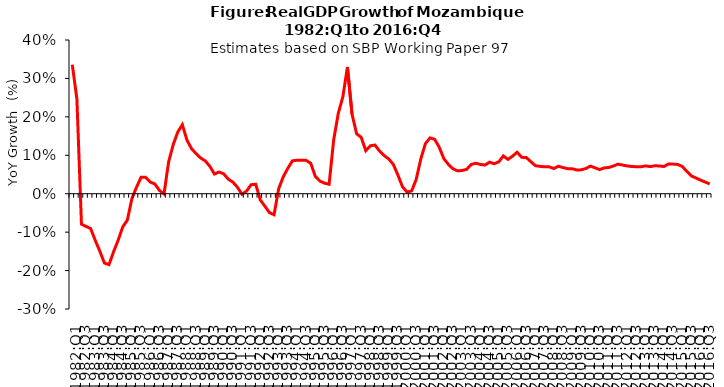
| Category | Series 0 |
|---|---|
| 1982:Q1 | 0.336 |
| 1982:Q2 | 0.247 |
| 1982:Q3 | -0.079 |
| 1982:Q4 | -0.085 |
| 1983:Q1 | -0.091 |
| 1983:Q2 | -0.121 |
| 1983:Q3 | -0.15 |
| 1983:Q4 | -0.18 |
| 1984:Q1 | -0.185 |
| 1984:Q2 | -0.151 |
| 1984:Q3 | -0.121 |
| 1984:Q4 | -0.086 |
| 1985:Q1 | -0.069 |
| 1985:Q2 | -0.013 |
| 1985:Q3 | 0.017 |
| 1985:Q4 | 0.043 |
| 1986:Q1 | 0.043 |
| 1986:Q2 | 0.03 |
| 1986:Q3 | 0.025 |
| 1986:Q4 | 0.009 |
| 1987:Q1 | 0 |
| 1987:Q2 | 0.082 |
| 1987:Q3 | 0.128 |
| 1987:Q4 | 0.161 |
| 1988:Q1 | 0.18 |
| 1988:Q2 | 0.14 |
| 1988:Q3 | 0.117 |
| 1988:Q4 | 0.104 |
| 1989:Q1 | 0.093 |
| 1989:Q2 | 0.085 |
| 1989:Q3 | 0.071 |
| 1989:Q4 | 0.051 |
| 1990:Q1 | 0.056 |
| 1990:Q2 | 0.052 |
| 1990:Q3 | 0.038 |
| 1990:Q4 | 0.03 |
| 1991:Q1 | 0.017 |
| 1991:Q2 | -0.001 |
| 1991:Q3 | 0.007 |
| 1991:Q4 | 0.023 |
| 1992:Q1 | 0.025 |
| 1992:Q2 | -0.016 |
| 1992:Q3 | -0.032 |
| 1992:Q4 | -0.049 |
| 1993:Q1 | -0.055 |
| 1993:Q2 | 0.013 |
| 1993:Q3 | 0.044 |
| 1993:Q4 | 0.066 |
| 1994:Q1 | 0.086 |
| 1994:Q2 | 0.087 |
| 1994:Q3 | 0.087 |
| 1994:Q4 | 0.087 |
| 1995:Q1 | 0.079 |
| 1995:Q2 | 0.045 |
| 1995:Q3 | 0.033 |
| 1995:Q4 | 0.027 |
| 1996:Q1 | 0.025 |
| 1996:Q2 | 0.14 |
| 1996:Q3 | 0.209 |
| 1996:Q4 | 0.252 |
| 1997:Q1 | 0.33 |
| 1997:Q2 | 0.207 |
| 1997:Q3 | 0.156 |
| 1997:Q4 | 0.147 |
| 1998:Q1 | 0.112 |
| 1998:Q2 | 0.125 |
| 1998:Q3 | 0.127 |
| 1998:Q4 | 0.111 |
| 1999:Q1 | 0.099 |
| 1999:Q2 | 0.09 |
| 1999:Q3 | 0.076 |
| 1999:Q4 | 0.049 |
| 2000:Q1 | 0.018 |
| 2000:Q2 | 0.004 |
| 2000:Q3 | 0.007 |
| 2000:Q4 | 0.037 |
| 2001:Q1 | 0.09 |
| 2001:Q2 | 0.13 |
| 2001:Q3 | 0.145 |
| 2001:Q4 | 0.142 |
| 2002:Q1 | 0.121 |
| 2002:Q2 | 0.092 |
| 2002:Q3 | 0.077 |
| 2002:Q4 | 0.065 |
| 2003:Q1 | 0.06 |
| 2003:Q2 | 0.06 |
| 2003:Q3 | 0.063 |
| 2003:Q4 | 0.076 |
| 2004:Q1 | 0.079 |
| 2004:Q2 | 0.076 |
| 2004:Q3 | 0.075 |
| 2004:Q4 | 0.082 |
| 2005:Q1 | 0.078 |
| 2005:Q2 | 0.083 |
| 2005:Q3 | 0.098 |
| 2005:Q4 | 0.089 |
| 2006:Q1 | 0.098 |
| 2006:Q2 | 0.108 |
| 2006:Q3 | 0.095 |
| 2006:Q4 | 0.094 |
| 2007:Q1 | 0.083 |
| 2007:Q2 | 0.073 |
| 2007:Q3 | 0.071 |
| 2007:Q4 | 0.07 |
| 2008:Q1 | 0.07 |
| 2008:Q2 | 0.065 |
| 2008:Q3 | 0.072 |
| 2008:Q4 | 0.068 |
| 2009:Q1 | 0.065 |
| 2009:Q2 | 0.065 |
| 2009:Q3 | 0.062 |
| 2009:Q4 | 0.062 |
| 2010:Q1 | 0.066 |
| 2010:Q2 | 0.072 |
| 2010:Q3 | 0.067 |
| 2010:Q4 | 0.063 |
| 2011:Q1 | 0.067 |
| 2011:Q2 | 0.068 |
| 2011:Q3 | 0.072 |
| 2011:Q4 | 0.077 |
| 2012:Q1 | 0.075 |
| 2012:Q2 | 0.072 |
| 2012:Q3 | 0.071 |
| 2012:Q4 | 0.07 |
| 2013:Q1 | 0.07 |
| 2013:Q2 | 0.072 |
| 2013:Q3 | 0.07 |
| 2013:Q4 | 0.073 |
| 2014:Q1 | 0.072 |
| 2014:Q2 | 0.071 |
| 2014:Q3 | 0.077 |
| 2014:Q4 | 0.077 |
| 2015:Q1 | 0.076 |
| 2015:Q2 | 0.071 |
| 2015:Q3 | 0.058 |
| 2015:Q4 | 0.046 |
| 2016:Q1 | 0.041 |
| 2016:Q2 | 0.035 |
| 2016:Q3 | 0.03 |
| 2016:Q4 | 0.025 |